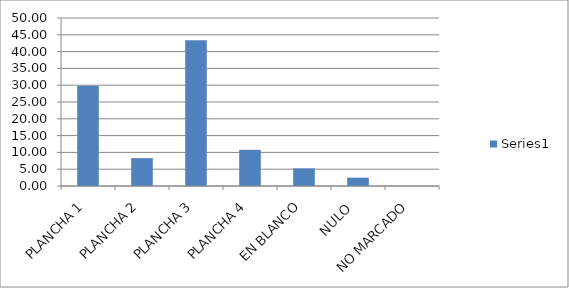
| Category | Series 0 |
|---|---|
| PLANCHA 1 | 29.834 |
| PLANCHA 2 | 8.287 |
| PLANCHA 3 | 43.37 |
| PLANCHA 4 | 10.773 |
| EN BLANCO | 5.249 |
| NULO  | 2.486 |
| NO MARCADO | 0 |